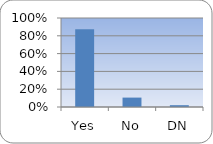
| Category | Series 0 |
|---|---|
| Yes | 0.874 |
| No | 0.106 |
| DN | 0.02 |